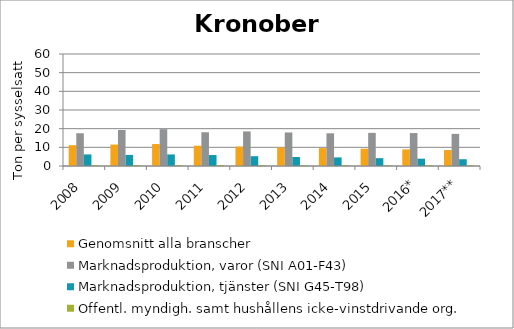
| Category | Genomsnitt alla branscher | Marknadsproduktion, varor (SNI A01-F43) | Marknadsproduktion, tjänster (SNI G45-T98) | Offentl. myndigh. samt hushållens icke-vinstdrivande org. |
|---|---|---|---|---|
| 2008 | 11.146 | 17.543 | 6.199 | 0.486 |
| 2009 | 11.491 | 19.295 | 5.939 | 0.47 |
| 2010 | 11.762 | 19.723 | 6.199 | 0.5 |
| 2011 | 10.873 | 18.077 | 5.874 | 0.473 |
| 2012 | 10.433 | 18.518 | 5.244 | 0.47 |
| 2013 | 9.922 | 17.981 | 4.816 | 0.424 |
| 2014 | 9.564 | 17.519 | 4.603 | 0.394 |
| 2015 | 9.254 | 17.751 | 4.194 | 0.371 |
| 2016* | 8.901 | 17.648 | 3.911 | 0.363 |
| 2017** | 8.555 | 17.207 | 3.632 | 0.348 |